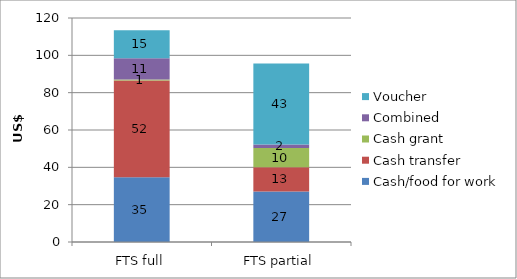
| Category | Cash/food for work | Cash transfer | Cash grant | Combined | Voucher |
|---|---|---|---|---|---|
| FTS full | 34.673 | 51.874 | 0.519 | 11.363 | 15.071 |
| FTS partial | 27.052 | 12.998 | 10.3 | 1.874 | 43.387 |